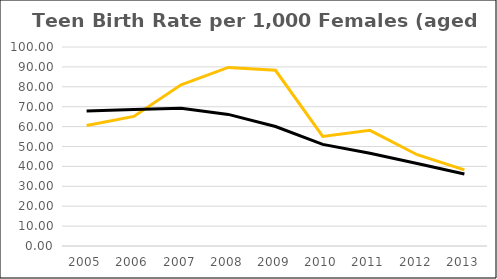
| Category | Teen Birth Rate per 1,000 Females (aged 15-19) |
|---|---|
| 2005.0 | 67.9 |
| 2006.0 | 68.619 |
| 2007.0 | 69.191 |
| 2008.0 | 66.131 |
| 2009.0 | 60.052 |
| 2010.0 | 51.073 |
| 2011.0 | 46.584 |
| 2012.0 | 41.472 |
| 2013.0 | 36.148 |